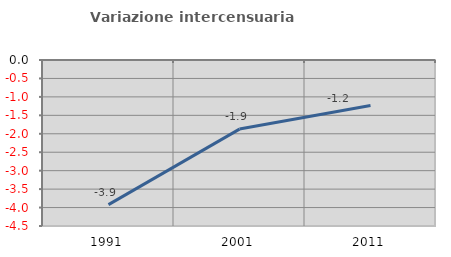
| Category | Variazione intercensuaria annua |
|---|---|
| 1991.0 | -3.92 |
| 2001.0 | -1.873 |
| 2011.0 | -1.234 |